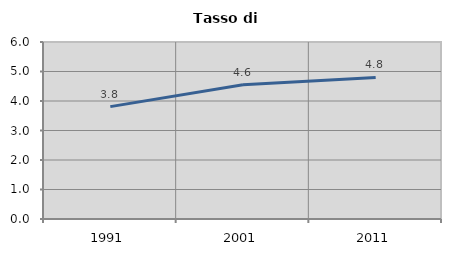
| Category | Tasso di disoccupazione   |
|---|---|
| 1991.0 | 3.81 |
| 2001.0 | 4.554 |
| 2011.0 | 4.799 |